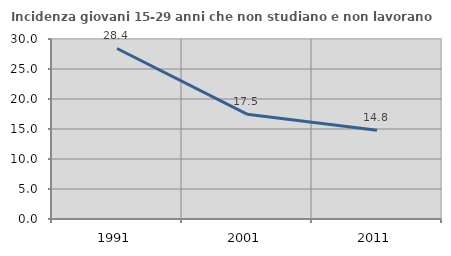
| Category | Incidenza giovani 15-29 anni che non studiano e non lavorano  |
|---|---|
| 1991.0 | 28.421 |
| 2001.0 | 17.47 |
| 2011.0 | 14.789 |